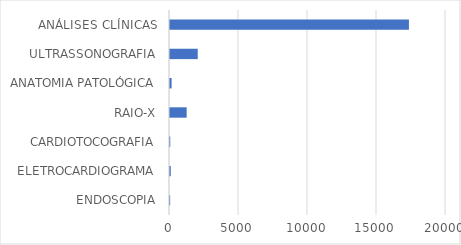
| Category | Series 0 |
|---|---|
| ENDOSCOPIA | 11 |
| ELETROCARDIOGRAMA | 57 |
| CARDIOTOCOGRAFIA | 20 |
| RAIO-X | 1208 |
| ANATOMIA PATOLÓGICA | 116 |
| ULTRASSONOGRAFIA | 2010 |
| ANÁLISES CLÍNICAS | 17313 |